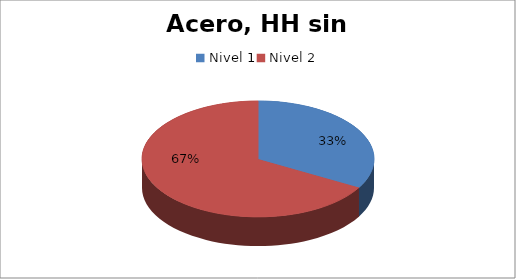
| Category | HH |
|---|---|
| Nivel 1 | 39.025 |
| Nivel 2 | 78.435 |